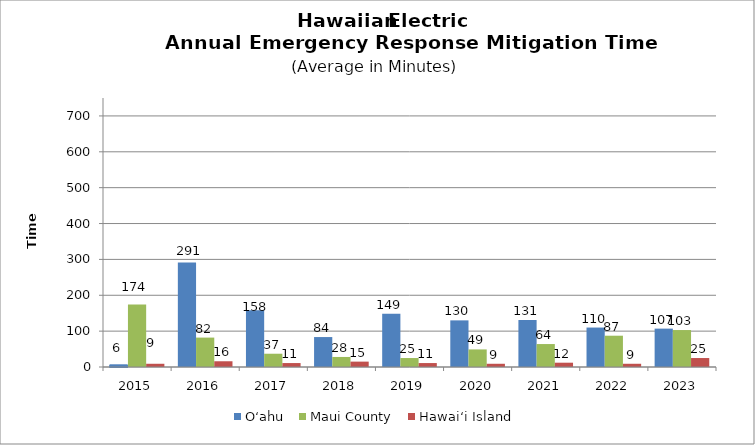
| Category | O‘ahu | Maui County | Hawai‘i Island |
|---|---|---|---|
| 2015.0 | 6 | 174 | 9 |
| 2016.0 | 291.48 | 82 | 16 |
| 2017.0 | 157.95 | 37 | 11 |
| 2018.0 | 83.5 | 28 | 15 |
| 2019.0 | 148.52 | 25 | 11 |
| 2020.0 | 130 | 49 | 9 |
| 2021.0 | 131 | 64 | 12 |
| 2022.0 | 110 | 87.25 | 9 |
| 2023.0 | 107 | 103 | 25 |